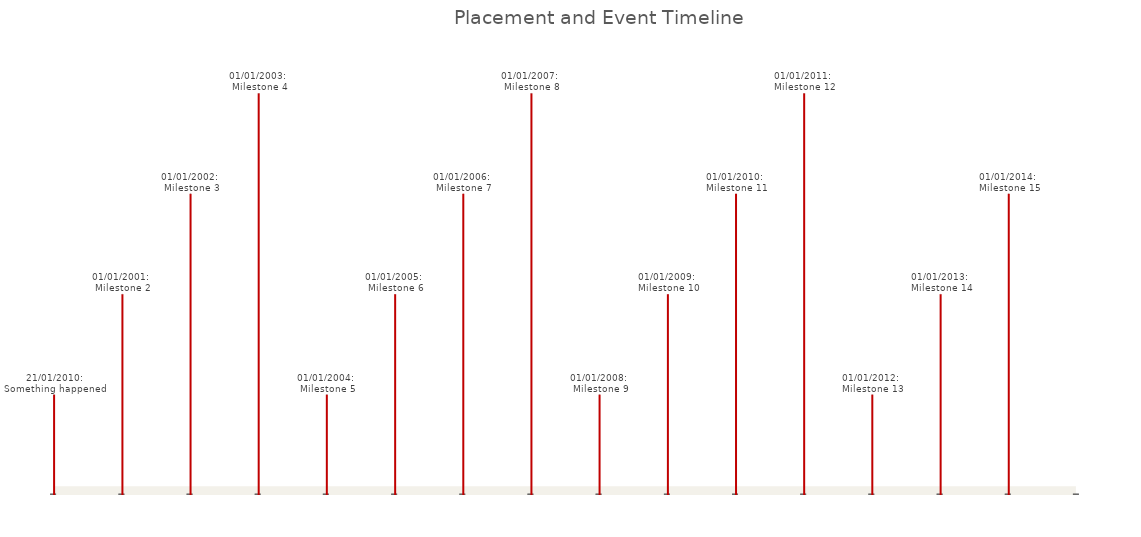
| Category | Series 0 |
|---|---|
| 1/1/00 | 25 |
| 1/1/01 | 50 |
| 1/1/02 | 75 |
| 1/1/03 | 100 |
| 1/1/04 | 25 |
| 1/1/05 | 50 |
| 1/1/06 | 75 |
| 1/1/07 | 100 |
| 1/1/08 | 25 |
| 1/1/09 | 50 |
| 1/1/10 | 75 |
| 1/1/11 | 100 |
| 1/1/12 | 25 |
| 1/1/13 | 50 |
| 1/1/14 | 75 |
| 1/1/15 | 100 |